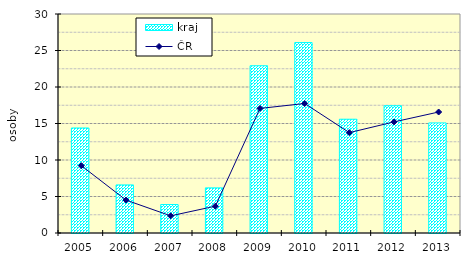
| Category | kraj |
|---|---|
| 2005.0 | 14.384 |
| 2006.0 | 6.584 |
| 2007.0 | 3.902 |
| 2008.0 | 6.181 |
| 2009.0 | 22.911 |
| 2010.0 | 26.09 |
| 2011.0 | 15.585 |
| 2012.0 | 17.436 |
| 2013.0 | 15.083 |